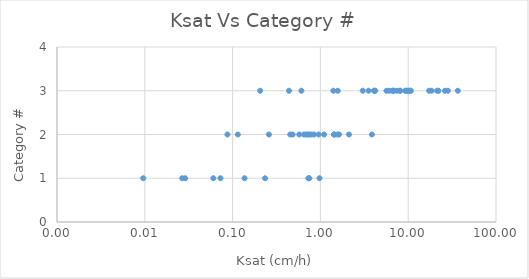
| Category | Series 0 |
|---|---|
| 0.02667 | 1 |
| 0.13682 | 1 |
| 0.74808 | 1 |
| 0.72955 | 1 |
| 0.97621 | 1 |
| 0.07272 | 1 |
| 0.06033 | 1 |
| 0.2342 | 1 |
| 0.02885 | 1 |
| 0.0096 | 1 |
| 0.74488 | 2 |
| 0.45336 | 2 |
| 0.64797 | 2 |
| 0.84416 | 2 |
| 1.62899 | 2 |
| 3.85941 | 2 |
| 0.25915 | 2 |
| 0.08735 | 2 |
| 0.1147 | 2 |
| 1.44105 | 2 |
| 0.954 | 2 |
| 2.11541 | 2 |
| 0.68855 | 2 |
| 0.57484 | 2 |
| 0.72013 | 2 |
| 1.42692 | 2 |
| 1.43532 | 2 |
| 0.48301 | 2 |
| 1.56907 | 2 |
| 1.10244 | 2 |
| 0.79305 | 2 |
| 0.2059 | 3 |
| 0.60727 | 3 |
| 0.43861 | 3 |
| 1.40313 | 3 |
| 3.03754 | 3 |
| 6.06448 | 3 |
| 6.69682 | 3 |
| 4.13284 | 3 |
| 5.65748 | 3 |
| 6.61827 | 3 |
| 6.83903 | 3 |
| 4.08028 | 3 |
| 9.22852 | 3 |
| 10.2149 | 3 |
| 8.01189 | 3 |
| 22.09951 | 3 |
| 26.20677 | 3 |
| 7.41502 | 3 |
| 9.58179 | 3 |
| 10.53532 | 3 |
| 8.14831 | 3 |
| 21.35593 | 3 |
| 1.57712 | 3 |
| 4.21335 | 3 |
| 3.53584 | 3 |
| 10.73709 | 3 |
| 28.34922 | 3 |
| 36.72754 | 3 |
| 17.29621 | 3 |
| 18.4797 | 3 |
| 9.85822 | 3 |